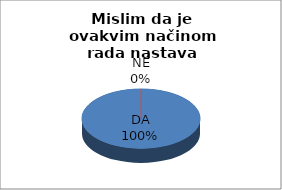
| Category | Series 0 |
|---|---|
| DA | 18 |
| NE | 0 |